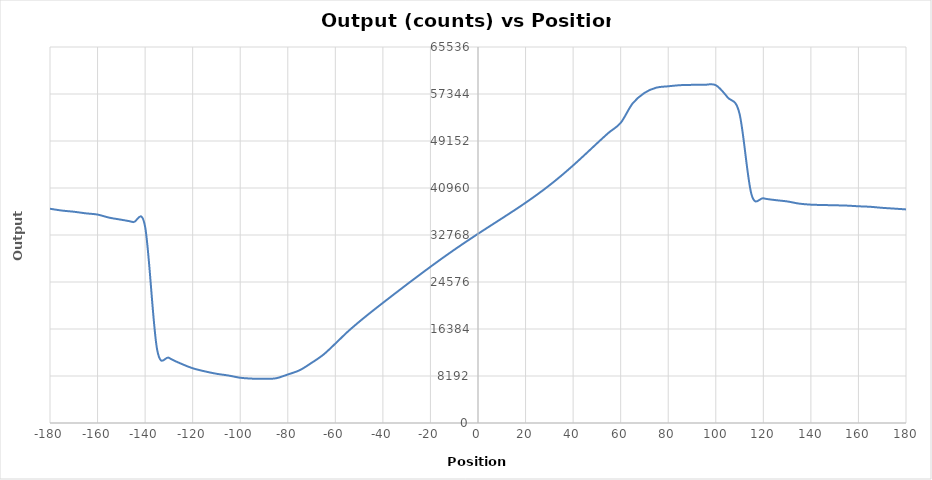
| Category | Dig |
|---|---|
| -180.0 | 37344 |
| -175.0 | 37028 |
| -170.0 | 36825 |
| -165.0 | 36547 |
| -160.0 | 36329 |
| -155.0 | 35781 |
| -150.0 | 35427 |
| -145.0 | 35015 |
| -140.0 | 34210 |
| -135.0 | 12913 |
| -130.0 | 11366 |
| -125.0 | 10359 |
| -120.0 | 9543 |
| -115.0 | 9011 |
| -110.0 | 8583 |
| -105.0 | 8279 |
| -100.0 | 7886 |
| -95.0 | 7734 |
| -90.0 | 7712 |
| -85.0 | 7790 |
| -80.0 | 8453 |
| -75.0 | 9197 |
| -70.0 | 10482 |
| -65.0 | 11919 |
| -60.0 | 13836.2 |
| -55.0 | 15836.184 |
| -50.0 | 17631.25 |
| -45.0 | 19313.64 |
| -40.0 | 20939.8 |
| -35.0 | 22539.252 |
| -30.0 | 24122.45 |
| -25.0 | 25687.621 |
| -20.0 | 27226.6 |
| -15.0 | 28729.646 |
| -10.0 | 30189.25 |
| -5.0 | 31602.927 |
| 0.0 | 32975 |
| 5.0 | 34317.365 |
| 10.0 | 35649.25 |
| 15.0 | 36995.959 |
| 20.0 | 38386.6 |
| 25.0 | 39850.809 |
| 30.0 | 41414.45 |
| 35.0 | 43094.315 |
| 40.0 | 44891.8 |
| 45.0 | 46785.577 |
| 50.0 | 48723.25 |
| 55.0 | 50611.996 |
| 60.0 | 52308.2 |
| 65.0 | 55684 |
| 70.0 | 57534 |
| 75.0 | 58451 |
| 80.0 | 58688 |
| 85.0 | 58883 |
| 90.0 | 58936 |
| 95.0 | 58936 |
| 100.0 | 58880 |
| 105.0 | 56748 |
| 110.0 | 53884 |
| 115.0 | 39866 |
| 120.0 | 39162 |
| 125.0 | 38855 |
| 130.0 | 38623 |
| 135.0 | 38242 |
| 140.0 | 38056 |
| 145.0 | 37995 |
| 150.0 | 37947 |
| 155.0 | 37894 |
| 160.0 | 37775 |
| 165.0 | 37684 |
| 170.0 | 37502 |
| 175.0 | 37370 |
| 180.0 | 37229 |